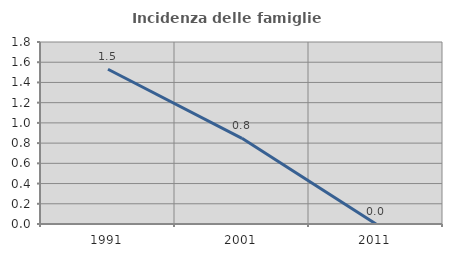
| Category | Incidenza delle famiglie numerose |
|---|---|
| 1991.0 | 1.531 |
| 2001.0 | 0.847 |
| 2011.0 | 0 |